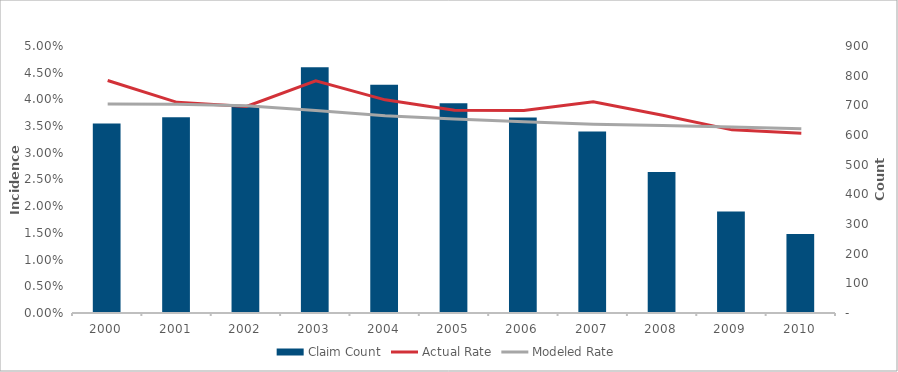
| Category | Claim Count |
|---|---|
| 2000.0 | 639 |
| 2001.0 | 660 |
| 2002.0 | 701 |
| 2003.0 | 828 |
| 2004.0 | 769 |
| 2005.0 | 707 |
| 2006.0 | 659 |
| 2007.0 | 612 |
| 2008.0 | 475 |
| 2009.0 | 342 |
| 2010.0 | 266 |